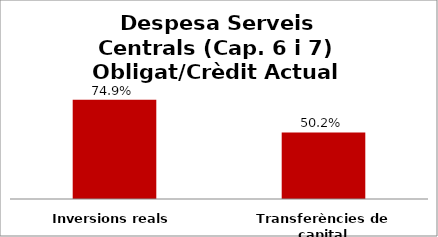
| Category | Series 0 |
|---|---|
| Inversions reals | 0.749 |
| Transferències de capital | 0.502 |